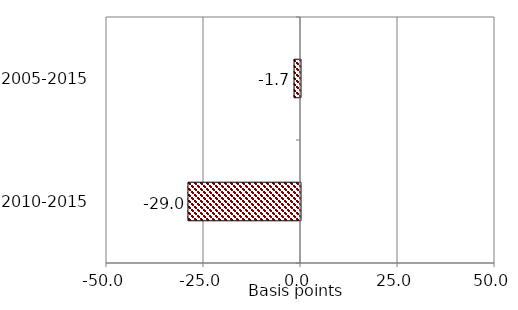
| Category | Series 0 |
|---|---|
| 2010-2015 | -29 |
| 2005-2015 | -1.66 |